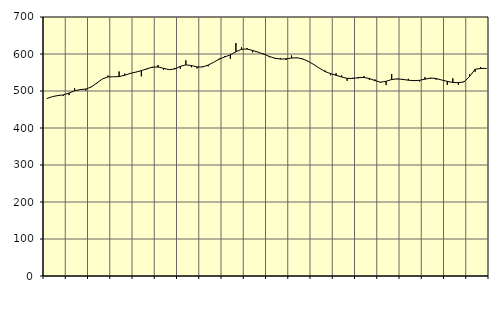
| Category | Piggar | Series 1 |
|---|---|---|
| nan | 479.4 | 479.61 |
| 1.0 | 485 | 484.75 |
| 1.0 | 488.3 | 487.7 |
| 1.0 | 486.7 | 489.53 |
| nan | 489 | 494.46 |
| 2.0 | 507.5 | 500.58 |
| 2.0 | 504.4 | 503.74 |
| 2.0 | 501.2 | 505.26 |
| nan | 511.7 | 510.77 |
| 3.0 | 520.4 | 521.6 |
| 3.0 | 532.8 | 532.55 |
| 3.0 | 541.6 | 538.12 |
| nan | 538.6 | 538.52 |
| 4.0 | 552.7 | 538.89 |
| 4.0 | 547 | 542.62 |
| 4.0 | 546.4 | 547.43 |
| nan | 550.4 | 551.1 |
| 5.0 | 539.6 | 554.93 |
| 5.0 | 558.8 | 559.98 |
| 5.0 | 562.6 | 564.52 |
| nan | 570.3 | 564.83 |
| 6.0 | 557.2 | 561.3 |
| 6.0 | 557.7 | 557.81 |
| 6.0 | 562.3 | 559.5 |
| nan | 560.2 | 566.57 |
| 7.0 | 582.9 | 570.61 |
| 7.0 | 564.2 | 568.87 |
| 7.0 | 561 | 565.09 |
| nan | 566.2 | 564.94 |
| 8.0 | 566.5 | 570.03 |
| 8.0 | 577.8 | 577.58 |
| 8.0 | 587.5 | 586.11 |
| nan | 594.3 | 592.07 |
| 9.0 | 587.2 | 597.67 |
| 9.0 | 629.7 | 605.97 |
| 9.0 | 617.8 | 612.75 |
| nan | 616 | 613.47 |
| 10.0 | 604.6 | 609.66 |
| 10.0 | 604.5 | 604.91 |
| 10.0 | 601.2 | 599.65 |
| nan | 591.2 | 593.49 |
| 11.0 | 586.9 | 588.54 |
| 11.0 | 589 | 586.34 |
| 11.0 | 583.7 | 586.93 |
| nan | 596 | 589.05 |
| 12.0 | 590 | 589.71 |
| 12.0 | 585.7 | 586.81 |
| 12.0 | 580.8 | 580.15 |
| nan | 570.8 | 571.6 |
| 13.0 | 561.9 | 561.68 |
| 13.0 | 555.4 | 552.79 |
| 13.0 | 542.6 | 547.01 |
| nan | 548.1 | 542.5 |
| 14.0 | 542 | 538 |
| 14.0 | 527.5 | 534.2 |
| 14.0 | 535.7 | 533.87 |
| nan | 534.1 | 536.23 |
| 15.0 | 540.5 | 536.64 |
| 15.0 | 530 | 533.81 |
| 15.0 | 531.3 | 528.03 |
| nan | 521.6 | 523.84 |
| 16.0 | 516.1 | 526.24 |
| 16.0 | 546 | 530.92 |
| 16.0 | 531.6 | 532.85 |
| nan | 529.6 | 531.36 |
| 17.0 | 532.9 | 529.16 |
| 17.0 | 527 | 528.03 |
| 17.0 | 525.6 | 528.81 |
| nan | 537.5 | 531.99 |
| 18.0 | 533.2 | 535.06 |
| 18.0 | 530.6 | 533.62 |
| 18.0 | 529.8 | 529.7 |
| nan | 516.6 | 526.12 |
| 19.0 | 534.2 | 522.89 |
| 19.0 | 516.5 | 522.57 |
| 19.0 | 526.2 | 524.57 |
| nan | 544.6 | 539.19 |
| 20.0 | 552 | 558.72 |
| 20.0 | 564.9 | 560.94 |
| 20.0 | 559.7 | 561.14 |